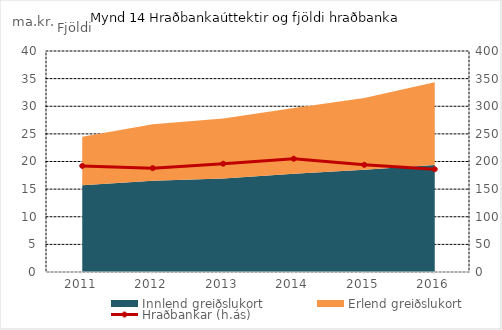
| Category | Hraðbankar (h.ás) |
|---|---|
| 0 | 192 |
| 1 | 188 |
| 2 | 196 |
| 3 | 205 |
| 4 | 194 |
| 5 | 186 |